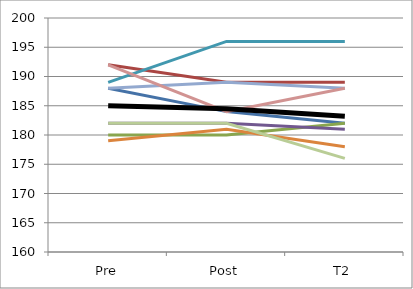
| Category | Series 0 | Series 1 | Series 2 | Series 3 | Series 4 | Series 5 | Series 6 | Series 7 | Series 8 | Mean |
|---|---|---|---|---|---|---|---|---|---|---|
| Pre | 188 | 192 | 180 | 182 | 189 | 179 | 188 | 192 | 182 | 185 |
| Post | 184 | 189 | 180 | 182 | 196 | 181 | 189 | 184 | 182 | 184.5 |
| T2 | 182 | 189 | 182 | 181 | 196 | 178 | 188 | 188 | 176 | 183.2 |